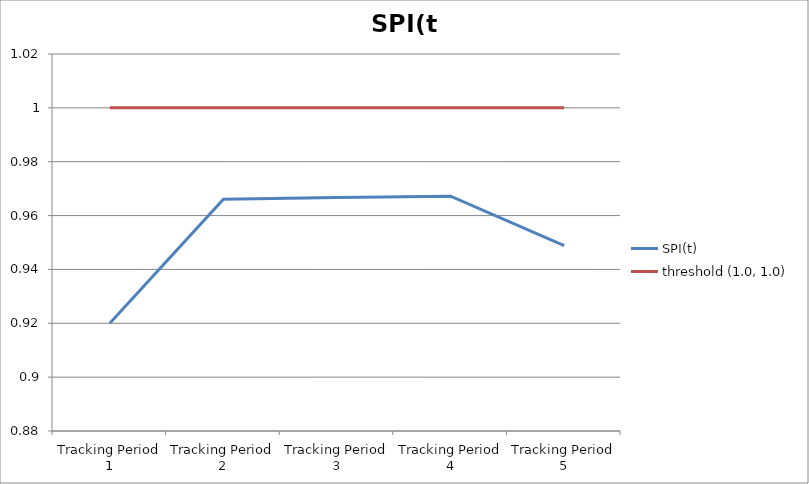
| Category | SPI(t) | threshold (1.0, 1.0) |
|---|---|---|
| Tracking Period 1 | 0.92 | 1 |
| Tracking Period 2 | 0.966 | 1 |
| Tracking Period 3 | 0.967 | 1 |
| Tracking Period 4 | 0.967 | 1 |
| Tracking Period 5 | 0.949 | 1 |